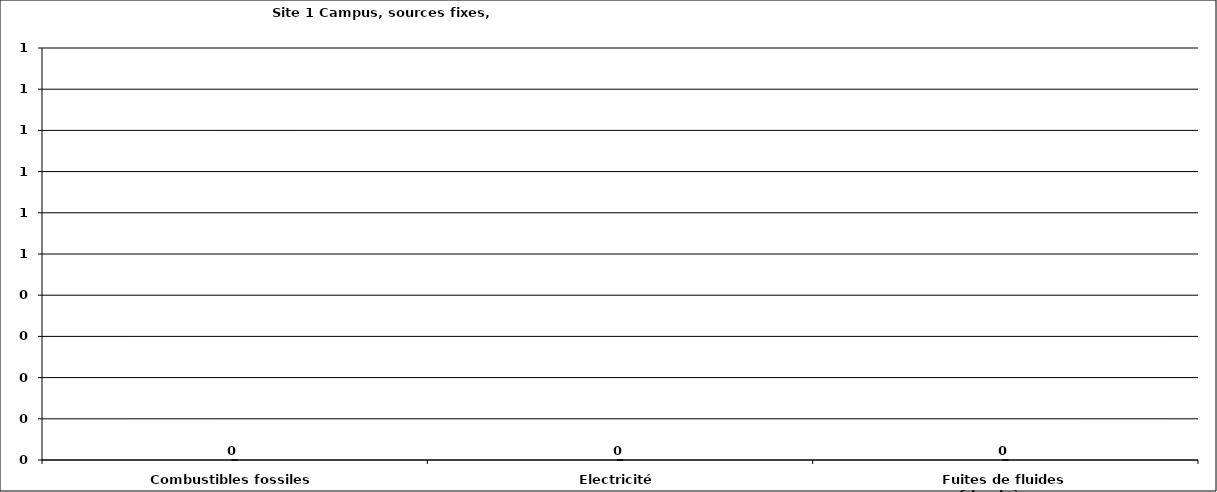
| Category | Series 0 |
|---|---|
| Combustibles fossiles | 0 |
| Electricité | 0 |
| Fuites de fluides frigorigènes | 0 |